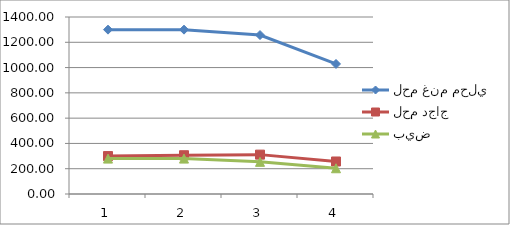
| Category | لحم غنم محلي | لحم دجاج | بيض |
|---|---|---|---|
| 0 | 1300 | 300 | 280 |
| 1 | 1300 | 306.667 | 280 |
| 2 | 1257.143 | 311.429 | 254.286 |
| 3 | 1028.571 | 257.143 | 203.571 |